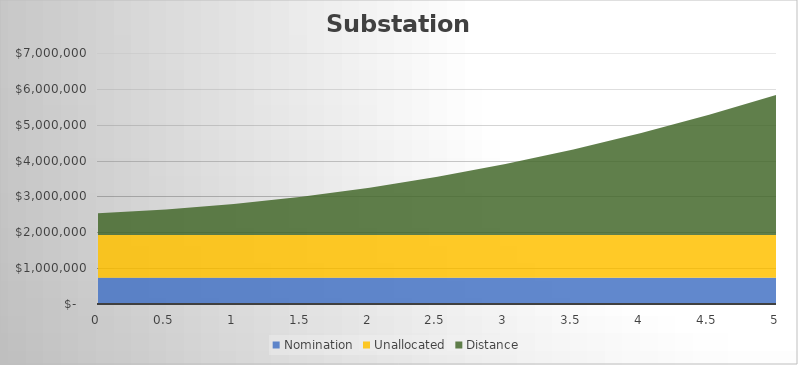
| Category | Nomination | Unallocated | Distance |
|---|---|---|---|
| 0.0 | 729875 | 1192129.167 | 611515.917 |
| 0.5 | 729875 | 1192129.167 | 712097.083 |
| 1.0 | 729875 | 1192129.167 | 863781.988 |
| 1.5 | 729875 | 1192129.167 | 1066570.632 |
| 2.0 | 729875 | 1192129.167 | 1320463.016 |
| 2.5 | 729875 | 1192129.167 | 1625459.138 |
| 3.0 | 729875 | 1192129.167 | 1981558.999 |
| 3.5 | 729875 | 1192129.167 | 2388762.599 |
| 4.0 | 729875 | 1192129.167 | 2847069.938 |
| 4.5 | 729875 | 1192129.167 | 3356481.016 |
| 5.0 | 729875 | 1192129.167 | 3916995.833 |